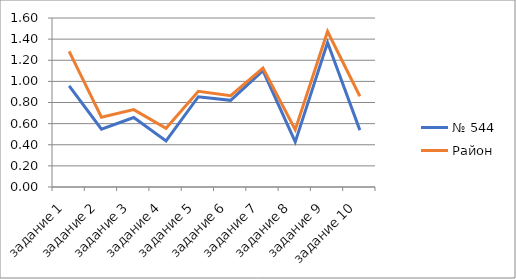
| Category | № 544 | Район  |
|---|---|---|
| задание 1 | 0.957 | 1.284 |
| задание 2 | 0.547 | 0.661 |
| задание 3 | 0.658 | 0.733 |
| задание 4 | 0.436 | 0.555 |
| задание 5 | 0.855 | 0.906 |
| задание 6 | 0.821 | 0.865 |
| задание 7 | 1.103 | 1.127 |
| задание 8 | 0.427 | 0.543 |
| задание 9 | 1.368 | 1.472 |
| задание 10 | 0.538 | 0.859 |